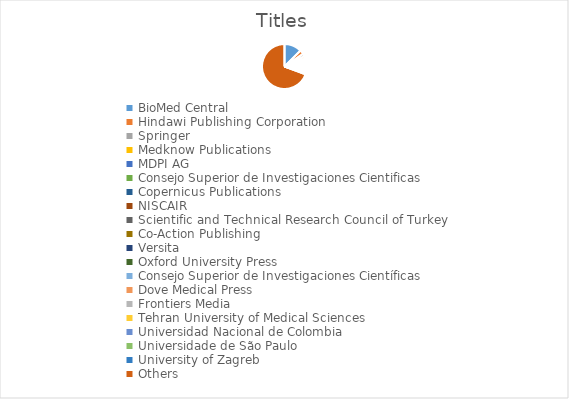
| Category | Titles |
|---|---|
| BioMed Central | 151 |
| Hindawi Publishing Corporation | 36 |
| Springer | 23 |
| Medknow Publications | 21 |
| MDPI AG | 16 |
| Consejo Superior de Investigaciones Cientificas | 14 |
| Copernicus Publications | 12 |
| NISCAIR | 12 |
| Scientific and Technical Research Council of Turkey | 10 |
| Co-Action Publishing | 9 |
| Versita | 9 |
| Oxford University Press | 8 |
| Consejo Superior de Investigaciones Científicas | 7 |
| Dove Medical Press | 7 |
| Frontiers Media | 7 |
| Tehran University of Medical Sciences | 7 |
| Universidad Nacional de Colombia | 7 |
| Universidade de São Paulo | 7 |
| University of Zagreb | 7 |
| Others | 836 |